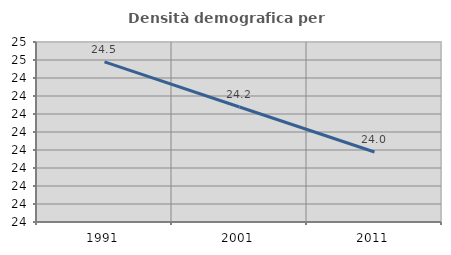
| Category | Densità demografica |
|---|---|
| 1991.0 | 24.489 |
| 2001.0 | 24.239 |
| 2011.0 | 23.989 |